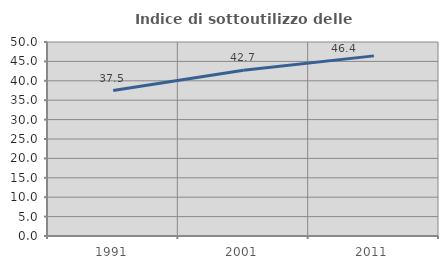
| Category | Indice di sottoutilizzo delle abitazioni  |
|---|---|
| 1991.0 | 37.495 |
| 2001.0 | 42.712 |
| 2011.0 | 46.423 |